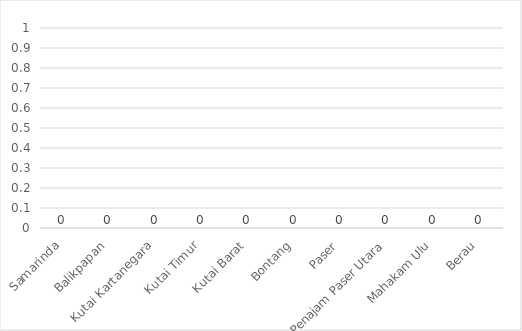
| Category | #REF! |
|---|---|
| Samarinda | 0 |
| Balikpapan | 0 |
| Kutai Kartanegara | 0 |
| Kutai Timur | 0 |
| Kutai Barat | 0 |
| Bontang | 0 |
| Paser | 0 |
| Penajam Paser Utara | 0 |
| Mahakam Ulu | 0 |
| Berau | 0 |